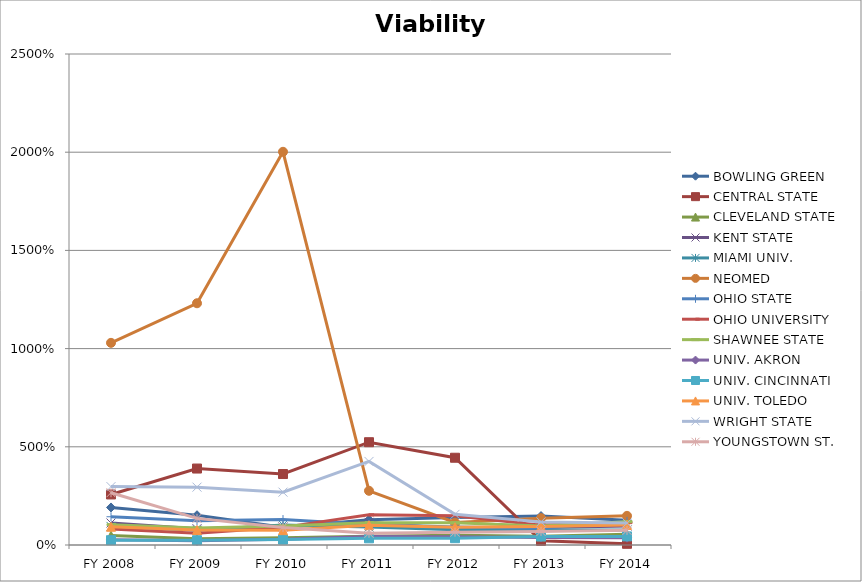
| Category | BOWLING GREEN  | CENTRAL STATE  | CLEVELAND STATE  | KENT STATE  | MIAMI UNIV.  | NEOMED  | OHIO STATE  | OHIO UNIVERSITY  | SHAWNEE STATE  | UNIV. AKRON  | UNIV. CINCINNATI  | UNIV. TOLEDO  | WRIGHT STATE  | YOUNGSTOWN ST.  |
|---|---|---|---|---|---|---|---|---|---|---|---|---|---|---|
| FY 2014 | 1.258 | 0.061 | 0.542 | 0.967 | 0.768 | 1.484 | 1.207 | 1.139 | 1.188 | 0.373 | 0.438 | 1.024 | 1.116 | 0.747 |
| FY 2013 | 1.473 | 0.212 | 0.441 | 0.896 | 0.758 | 1.366 | 0.857 | 1.012 | 0.964 | 0.388 | 0.433 | 0.944 | 1.177 | 0.693 |
| FY 2012 | 1.406 | 4.443 | 0.499 | 0.817 | 0.775 | 1.144 | 0.917 | 1.495 | 1.129 | 0.417 | 0.347 | 0.904 | 1.561 | 0.654 |
| FY 2011 | 1.291 | 5.234 | 0.44 | 1.156 | 0.912 | 2.76 | 1.041 | 1.534 | 1.139 | 0.438 | 0.341 | 1.007 | 4.254 | 0.598 |
| FY 2010 | 0.907 | 3.614 | 0.375 | 0.918 | 1.022 | 20.021 | 1.294 | 0.898 | 0.967 | 0.298 | 0.278 | 0.756 | 2.691 | 0.896 |
| FY 2009 | 1.515 | 3.893 | 0.317 | 0.831 | 0.752 | 12.309 | 1.24 | 0.603 | 0.87 | 0.214 | 0.243 | 0.76 | 2.946 | 1.355 |
| FY 2008 | 1.911 | 2.574 | 0.48 | 1.119 | 0.946 | 10.293 | 1.439 | 0.813 | 1.035 | 0.273 | 0.245 | 0.929 | 2.973 | 2.662 |